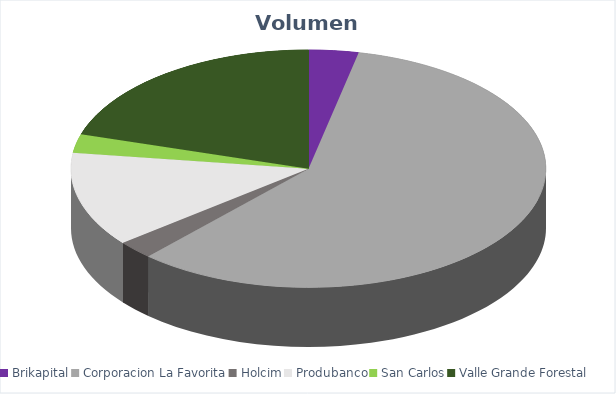
| Category | VOLUMEN ($USD) |
|---|---|
| Brikapital | 2000 |
| Corporacion La Favorita | 34505 |
| Holcim | 1470 |
| Produbanco | 7614.88 |
| San Carlos | 1500.05 |
| Valle Grande Forestal | 12001.6 |